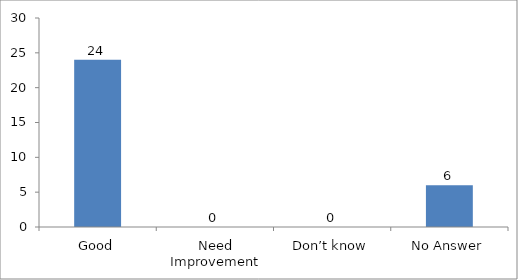
| Category | How would you rate the following aspects of the Changemaking Intelligence course?
The way the course is carried out. |
|---|---|
| Good | 24 |
| Need Improvement | 0 |
| Don’t know | 0 |
| No Answer | 6 |